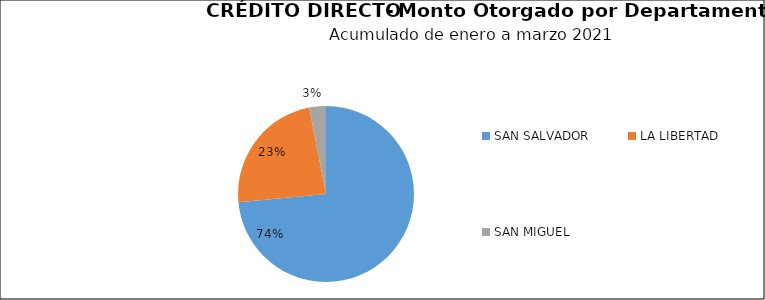
| Category | Monto | Créditos |
|---|---|---|
| SAN SALVADOR | 59.4 | 18 |
| LA LIBERTAD | 18.95 | 11 |
| SAN MIGUEL | 2.475 | 3 |